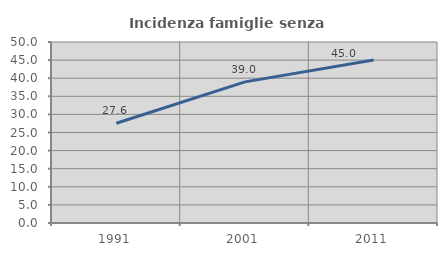
| Category | Incidenza famiglie senza nuclei |
|---|---|
| 1991.0 | 27.556 |
| 2001.0 | 38.988 |
| 2011.0 | 45 |